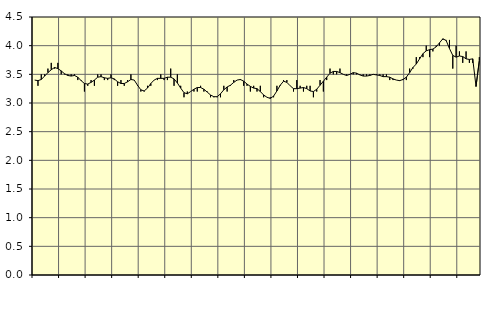
| Category | Piggar | Personliga och kulturella tjänster, SNI 90-98 |
|---|---|---|
| nan | 3.4 | 3.4 |
| 87.0 | 3.3 | 3.39 |
| 87.0 | 3.5 | 3.41 |
| 87.0 | 3.5 | 3.47 |
| nan | 3.6 | 3.53 |
| 88.0 | 3.7 | 3.58 |
| 88.0 | 3.6 | 3.62 |
| 88.0 | 3.7 | 3.6 |
| nan | 3.5 | 3.56 |
| 89.0 | 3.5 | 3.51 |
| 89.0 | 3.5 | 3.48 |
| 89.0 | 3.5 | 3.47 |
| nan | 3.5 | 3.48 |
| 90.0 | 3.4 | 3.45 |
| 90.0 | 3.4 | 3.39 |
| 90.0 | 3.2 | 3.34 |
| nan | 3.3 | 3.33 |
| 91.0 | 3.4 | 3.36 |
| 91.0 | 3.3 | 3.4 |
| 91.0 | 3.5 | 3.45 |
| nan | 3.5 | 3.46 |
| 92.0 | 3.4 | 3.44 |
| 92.0 | 3.4 | 3.43 |
| 92.0 | 3.5 | 3.44 |
| nan | 3.4 | 3.42 |
| 93.0 | 3.3 | 3.37 |
| 93.0 | 3.4 | 3.34 |
| 93.0 | 3.3 | 3.34 |
| nan | 3.4 | 3.37 |
| 94.0 | 3.5 | 3.41 |
| 94.0 | 3.4 | 3.4 |
| 94.0 | 3.3 | 3.31 |
| nan | 3.2 | 3.23 |
| 95.0 | 3.2 | 3.21 |
| 95.0 | 3.3 | 3.26 |
| 95.0 | 3.3 | 3.34 |
| nan | 3.4 | 3.4 |
| 96.0 | 3.4 | 3.43 |
| 96.0 | 3.5 | 3.43 |
| 96.0 | 3.4 | 3.43 |
| nan | 3.4 | 3.45 |
| 97.0 | 3.6 | 3.45 |
| 97.0 | 3.3 | 3.42 |
| 97.0 | 3.5 | 3.35 |
| nan | 3.3 | 3.26 |
| 98.0 | 3.1 | 3.18 |
| 98.0 | 3.2 | 3.16 |
| 98.0 | 3.2 | 3.2 |
| nan | 3.2 | 3.24 |
| 99.0 | 3.2 | 3.27 |
| 99.0 | 3.3 | 3.27 |
| 99.0 | 3.2 | 3.24 |
| nan | 3.2 | 3.19 |
| 0.0 | 3.1 | 3.14 |
| 0.0 | 3.1 | 3.11 |
| 0.0 | 3.1 | 3.11 |
| nan | 3.1 | 3.16 |
| 1.0 | 3.3 | 3.23 |
| 1.0 | 3.2 | 3.28 |
| 1.0 | 3.3 | 3.31 |
| nan | 3.4 | 3.36 |
| 2.0 | 3.4 | 3.4 |
| 2.0 | 3.4 | 3.41 |
| 2.0 | 3.3 | 3.38 |
| nan | 3.3 | 3.33 |
| 3.0 | 3.2 | 3.29 |
| 3.0 | 3.3 | 3.26 |
| 3.0 | 3.2 | 3.25 |
| nan | 3.3 | 3.2 |
| 4.0 | 3.1 | 3.14 |
| 4.0 | 3.1 | 3.1 |
| 4.0 | 3.1 | 3.08 |
| nan | 3.1 | 3.12 |
| 5.0 | 3.3 | 3.21 |
| 5.0 | 3.3 | 3.31 |
| 5.0 | 3.4 | 3.38 |
| nan | 3.4 | 3.36 |
| 6.0 | 3.3 | 3.3 |
| 6.0 | 3.2 | 3.25 |
| 6.0 | 3.4 | 3.25 |
| nan | 3.3 | 3.26 |
| 7.0 | 3.2 | 3.27 |
| 7.0 | 3.3 | 3.25 |
| 7.0 | 3.3 | 3.21 |
| nan | 3.1 | 3.2 |
| 8.0 | 3.2 | 3.24 |
| 8.0 | 3.4 | 3.31 |
| 8.0 | 3.2 | 3.38 |
| nan | 3.4 | 3.45 |
| 9.0 | 3.6 | 3.52 |
| 9.0 | 3.5 | 3.55 |
| 9.0 | 3.5 | 3.55 |
| nan | 3.6 | 3.53 |
| 10.0 | 3.5 | 3.5 |
| 10.0 | 3.5 | 3.48 |
| 10.0 | 3.5 | 3.5 |
| nan | 3.5 | 3.53 |
| 11.0 | 3.5 | 3.52 |
| 11.0 | 3.5 | 3.49 |
| 11.0 | 3.5 | 3.47 |
| nan | 3.5 | 3.47 |
| 12.0 | 3.5 | 3.48 |
| 12.0 | 3.5 | 3.5 |
| 12.0 | 3.5 | 3.49 |
| nan | 3.5 | 3.48 |
| 13.0 | 3.5 | 3.46 |
| 13.0 | 3.5 | 3.46 |
| 13.0 | 3.4 | 3.45 |
| nan | 3.4 | 3.42 |
| 14.0 | 3.4 | 3.4 |
| 14.0 | 3.4 | 3.39 |
| 14.0 | 3.4 | 3.41 |
| nan | 3.4 | 3.45 |
| 15.0 | 3.6 | 3.53 |
| 15.0 | 3.6 | 3.62 |
| 15.0 | 3.8 | 3.68 |
| nan | 3.8 | 3.77 |
| 16.0 | 3.8 | 3.86 |
| 16.0 | 4 | 3.91 |
| 16.0 | 3.8 | 3.93 |
| nan | 3.9 | 3.94 |
| 17.0 | 4 | 3.98 |
| 17.0 | 4 | 4.05 |
| 17.0 | 4.1 | 4.12 |
| nan | 4.1 | 4.09 |
| 18.0 | 4.1 | 3.95 |
| 18.0 | 3.6 | 3.83 |
| 18.0 | 4 | 3.8 |
| nan | 3.9 | 3.82 |
| 19.0 | 3.7 | 3.81 |
| 19.0 | 3.9 | 3.77 |
| 19.0 | 3.7 | 3.76 |
| nan | 3.7 | 3.77 |
| 20.0 | 3.3 | 3.29 |
| 20.0 | 3.8 | 3.74 |